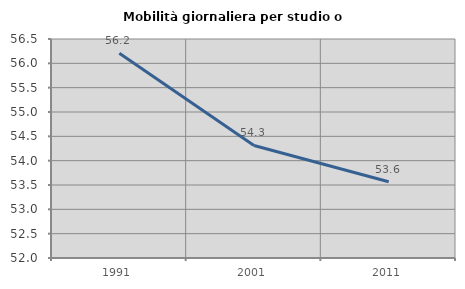
| Category | Mobilità giornaliera per studio o lavoro |
|---|---|
| 1991.0 | 56.208 |
| 2001.0 | 54.313 |
| 2011.0 | 53.566 |